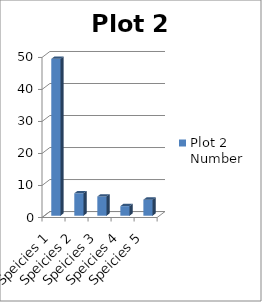
| Category | Plot 2 Number |
|---|---|
| Speicies 1 | 49 |
| Speicies 2 | 7 |
| Speicies 3 | 6 |
| Speicies 4 | 3 |
| Speicies 5 | 5 |